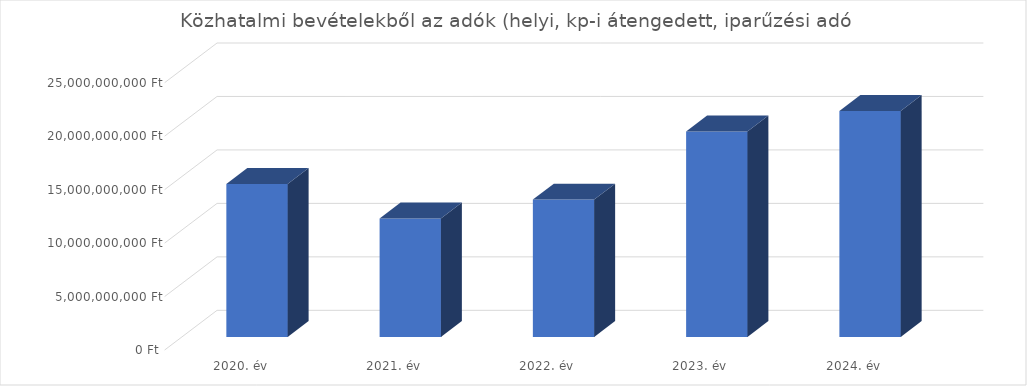
| Category | adók (helyi, kp-i átengedett)(iparűzési adó) |
|---|---|
| 2020. év | 14312470000 |
| 2021. év | 11084019000 |
| 2022. év | 12840884000 |
| 2023. év | 19214488000 |
| 2024. év | 21139110000 |